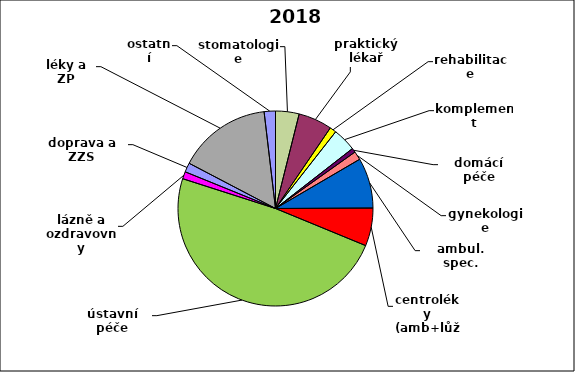
| Category | Series 0 |
|---|---|
| stomatologie | 0.039 |
| praktický lékař | 0.056 |
| rehabilitace | 0.011 |
| komplement | 0.039 |
| domácí péče | 0.007 |
| gynekologie | 0.014 |
| ambul. spec. | 0.083 |
| centroléky (amb+lůž) | 0.063 |
| ústavní péče | 0.487 |
| lázně a ozdravovny | 0.012 |
| doprava a ZZS | 0.015 |
| léky a ZP | 0.155 |
| ostatní | 0.019 |